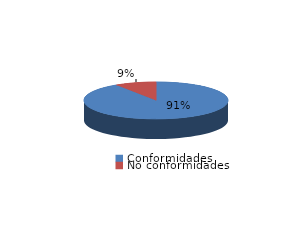
| Category | Series 0 |
|---|---|
| Conformidades | 616 |
| No conformidades | 63 |